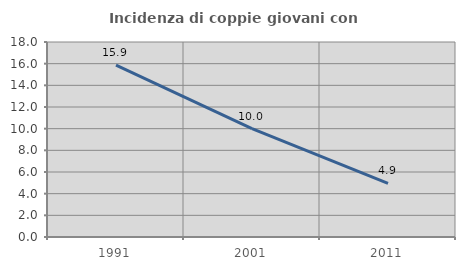
| Category | Incidenza di coppie giovani con figli |
|---|---|
| 1991.0 | 15.87 |
| 2001.0 | 10.011 |
| 2011.0 | 4.944 |